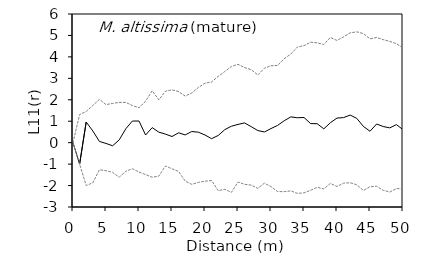
| Category | E11- | E11+ | Expect |
|---|---|---|---|
| 0.0 | 0 | 0 | 0 |
| 1.0 | -1 | -1 | 1.309 |
| 2.0 | 0.963 | -2 | 1.453 |
| 3.0 | 0.548 | -1.869 | 1.733 |
| 4.0 | 0.058 | -1.262 | 2.019 |
| 5.0 | -0.036 | -1.309 | 1.776 |
| 6.0 | -0.145 | -1.386 | 1.83 |
| 7.0 | 0.128 | -1.612 | 1.878 |
| 8.0 | 0.648 | -1.334 | 1.877 |
| 9.0 | 1.009 | -1.217 | 1.731 |
| 10.0 | 1.009 | -1.37 | 1.629 |
| 11.0 | 0.357 | -1.485 | 1.935 |
| 12.0 | 0.702 | -1.613 | 2.423 |
| 13.0 | 0.491 | -1.559 | 1.996 |
| 14.0 | 0.399 | -1.087 | 2.399 |
| 15.0 | 0.287 | -1.22 | 2.462 |
| 16.0 | 0.459 | -1.343 | 2.381 |
| 17.0 | 0.362 | -1.792 | 2.177 |
| 18.0 | 0.52 | -1.943 | 2.313 |
| 19.0 | 0.488 | -1.854 | 2.575 |
| 20.0 | 0.357 | -1.799 | 2.771 |
| 21.0 | 0.187 | -1.765 | 2.831 |
| 22.0 | 0.335 | -2.238 | 3.09 |
| 23.0 | 0.608 | -2.176 | 3.32 |
| 24.0 | 0.767 | -2.316 | 3.552 |
| 25.0 | 0.851 | -1.834 | 3.656 |
| 26.0 | 0.921 | -1.943 | 3.503 |
| 27.0 | 0.747 | -1.98 | 3.407 |
| 28.0 | 0.565 | -2.131 | 3.156 |
| 29.0 | 0.498 | -1.887 | 3.471 |
| 30.0 | 0.658 | -2.05 | 3.588 |
| 31.0 | 0.805 | -2.278 | 3.602 |
| 32.0 | 1.021 | -2.284 | 3.917 |
| 33.0 | 1.202 | -2.248 | 4.134 |
| 34.0 | 1.162 | -2.366 | 4.46 |
| 35.0 | 1.174 | -2.341 | 4.523 |
| 36.0 | 0.889 | -2.221 | 4.685 |
| 37.0 | 0.884 | -2.083 | 4.654 |
| 38.0 | 0.644 | -2.155 | 4.576 |
| 39.0 | 0.93 | -1.9 | 4.908 |
| 40.0 | 1.147 | -2.043 | 4.765 |
| 41.0 | 1.169 | -1.887 | 4.936 |
| 42.0 | 1.287 | -1.869 | 5.122 |
| 43.0 | 1.131 | -1.963 | 5.169 |
| 44.0 | 0.758 | -2.227 | 5.088 |
| 45.0 | 0.532 | -2.055 | 4.841 |
| 46.0 | 0.871 | -2.033 | 4.905 |
| 47.0 | 0.752 | -2.22 | 4.805 |
| 48.0 | 0.69 | -2.303 | 4.724 |
| 49.0 | 0.841 | -2.141 | 4.614 |
| 50.0 | 0.609 | -2.147 | 4.416 |